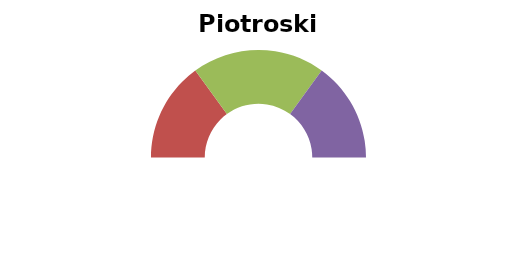
| Category | 332% |
|---|---|
| 0 | 0 |
| 1 | 30 |
| 2 | 40 |
| 3 | 30 |
| 4 | 100 |